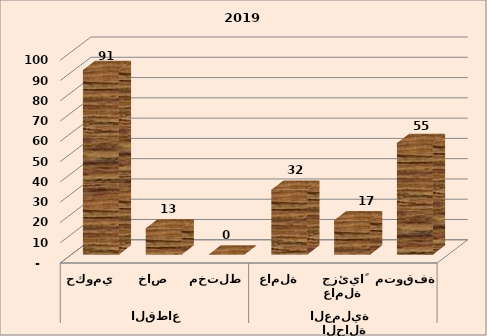
| Category | Series 0 |
|---|---|
| 0 | 91 |
| 1 | 13 |
| 2 | 0 |
| 3 | 32 |
| 4 | 17 |
| 5 | 55 |